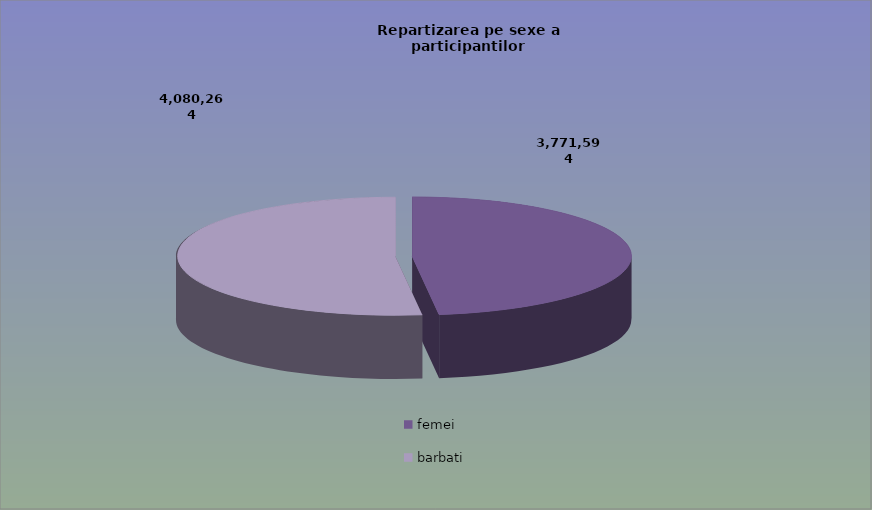
| Category | Series 0 |
|---|---|
| femei | 3771594 |
| barbati | 4080264 |